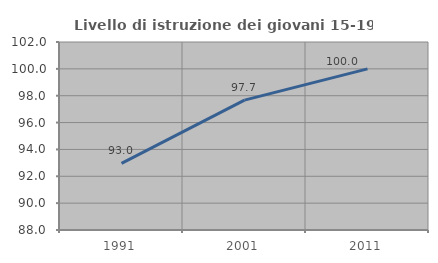
| Category | Livello di istruzione dei giovani 15-19 anni |
|---|---|
| 1991.0 | 92.958 |
| 2001.0 | 97.674 |
| 2011.0 | 100 |